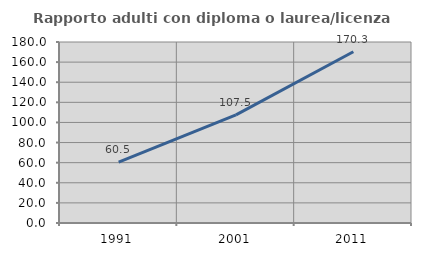
| Category | Rapporto adulti con diploma o laurea/licenza media  |
|---|---|
| 1991.0 | 60.53 |
| 2001.0 | 107.529 |
| 2011.0 | 170.347 |